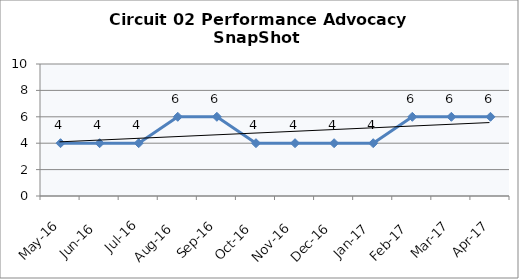
| Category | Circuit 02 |
|---|---|
| May-16 | 4 |
| Jun-16 | 4 |
| Jul-16 | 4 |
| Aug-16 | 6 |
| Sep-16 | 6 |
| Oct-16 | 4 |
| Nov-16 | 4 |
| Dec-16 | 4 |
| Jan-17 | 4 |
| Feb-17 | 6 |
| Mar-17 | 6 |
| Apr-17 | 6 |